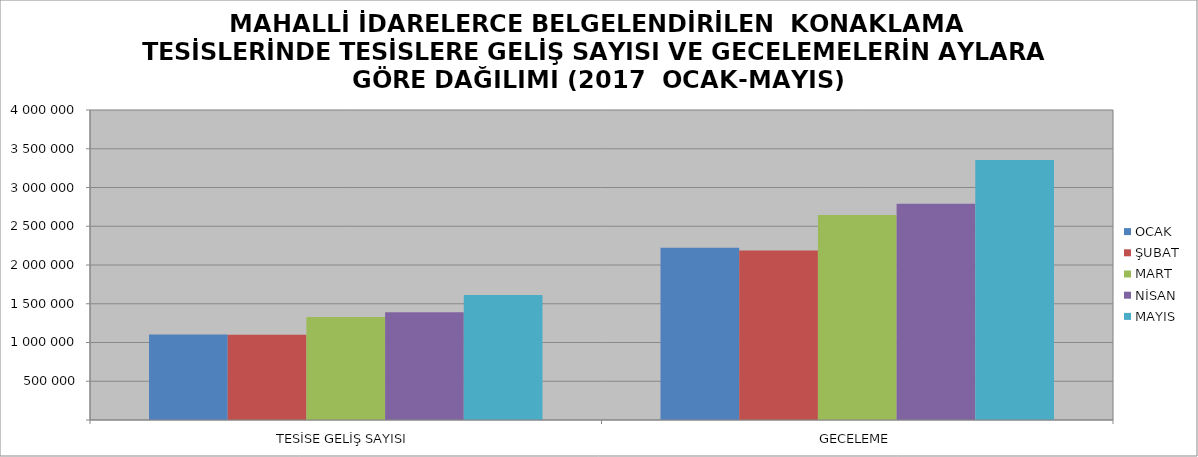
| Category | OCAK | ŞUBAT | MART | NİSAN | MAYIS |
|---|---|---|---|---|---|
| TESİSE GELİŞ SAYISI | 1104649 | 1099366 | 1327993 | 1389075 | 1611959 |
| GECELEME | 2222261 | 2187982 | 2645959 | 2791881 | 3355819 |